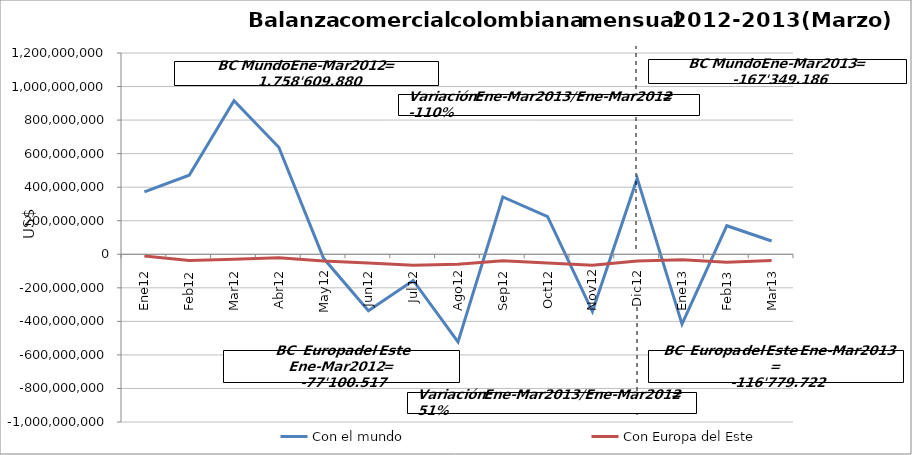
| Category | Con el mundo | Con Europa del Este |
|---|---|---|
| 0 | 371588601.84 | -9965078.19 |
| 1 | 471109607.31 | -37369708.93 |
| 2 | 915911670.59 | -29765729.78 |
| 3 | 637706812.67 | -21059550.81 |
| 4 | -24278377.48 | -40571465.21 |
| 5 | -336582158.92 | -51952541.47 |
| 6 | -156141093.75 | -64914347.06 |
| 7 | -522487753.65 | -59218101.89 |
| 8 | 341551791.65 | -38644125.52 |
| 9 | 224887257.5 | -51506693.33 |
| 10 | -341510254.09 | -64897851.8 |
| 11 | 452349103.5 | -39991786.39 |
| 12 | -416629494.45 | -32515319.29 |
| 13 | 170276250.68 | -47821618.86 |
| 14 | 79004057.69 | -36442783.72 |